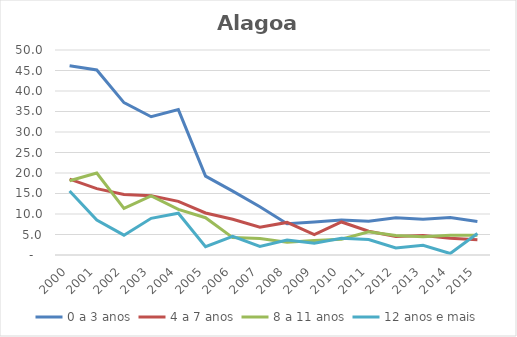
| Category | 0 a 3 anos | 4 a 7 anos | 8 a 11 anos | 12 anos e mais |
|---|---|---|---|---|
| 2000.0 | 46.157 | 18.505 | 18.103 | 15.625 |
| 2001.0 | 45.139 | 16.183 | 20 | 8.511 |
| 2002.0 | 37.155 | 14.745 | 11.364 | 4.839 |
| 2003.0 | 33.724 | 14.474 | 14.4 | 8.943 |
| 2004.0 | 35.457 | 13.077 | 11.111 | 10.185 |
| 2005.0 | 19.24 | 10.256 | 9.091 | 2.041 |
| 2006.0 | 15.571 | 8.723 | 4.242 | 4.545 |
| 2007.0 | 11.787 | 6.794 | 4.023 | 2.083 |
| 2008.0 | 7.617 | 7.946 | 3.097 | 3.636 |
| 2009.0 | 8.037 | 4.949 | 3.547 | 2.885 |
| 2010.0 | 8.551 | 8.059 | 3.86 | 4.07 |
| 2011.0 | 8.224 | 5.783 | 5.664 | 3.79 |
| 2012.0 | 9.097 | 4.514 | 4.756 | 1.718 |
| 2013.0 | 8.692 | 4.779 | 4.48 | 2.381 |
| 2014.0 | 9.172 | 4.096 | 4.798 | 0.358 |
| 2015.0 | 8.192 | 3.713 | 4.819 | 5.263 |